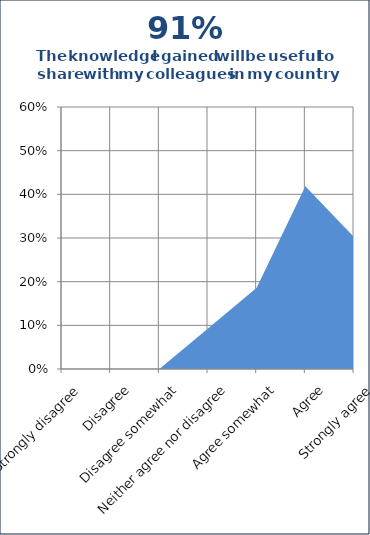
| Category | Series 1 |
|---|---|
| Strongly disagree | 0 |
| Disagree | 0 |
| Disagree somewhat | 0 |
| Neither agree nor disagree | 0.093 |
| Agree somewhat | 0.186 |
| Agree | 0.419 |
| Strongly agree | 0.302 |